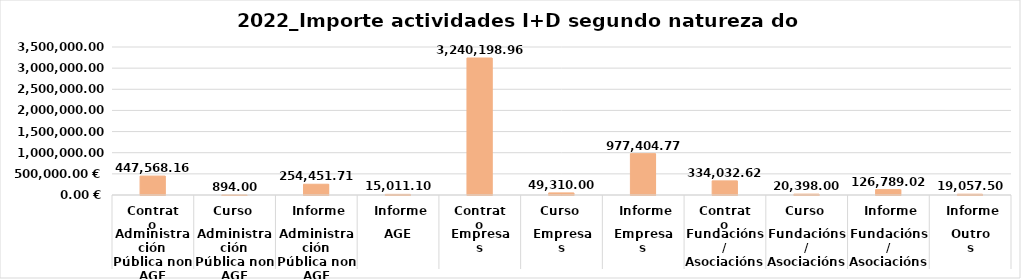
| Category | Series 1 | Series 0 |
|---|---|---|
| 0 | 447568.16 |  |
| 1 | 894 |  |
| 2 | 254451.71 |  |
| 3 | 15011.1 |  |
| 4 | 3240198.96 |  |
| 5 | 49310 |  |
| 6 | 977404.77 |  |
| 7 | 334032.62 |  |
| 8 | 20398 |  |
| 9 | 126789.02 |  |
| 10 | 19057.5 |  |